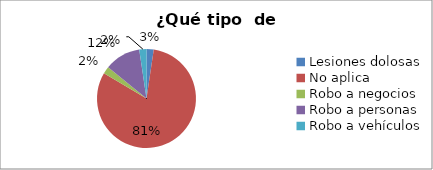
| Category | Series 0 |
|---|---|
| Lesiones dolosas | 0.024 |
| No aplica | 0.812 |
| Robo a negocios | 0.024 |
| Robo a personas | 0.118 |
| Robo a vehículos | 0.024 |